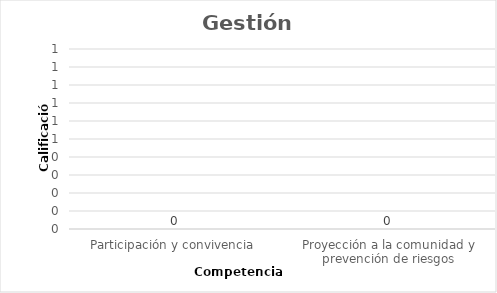
| Category | Series 0 |
|---|---|
| Participación y convivencia  | 0 |
| Proyección a la comunidad y prevención de riesgos | 0 |